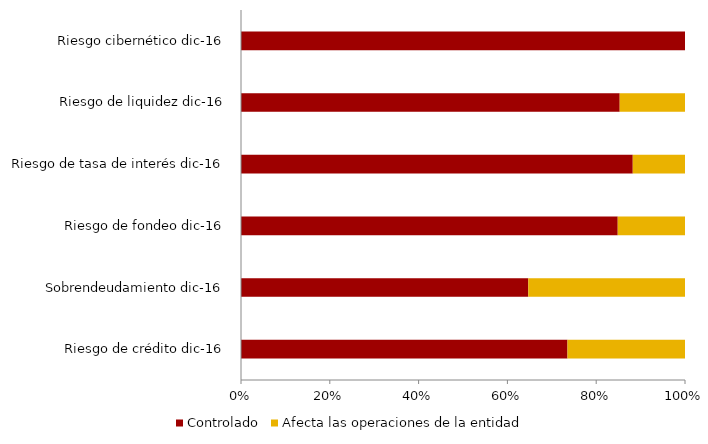
| Category | Controlado | Afecta las operaciones de la entidad |
|---|---|---|
| Riesgo de crédito dic-16 | 0.735 | 0.265 |
| Sobrendeudamiento dic-16 | 0.647 | 0.353 |
| Riesgo de fondeo dic-16 | 0.848 | 0.152 |
| Riesgo de tasa de interés dic-16 | 0.882 | 0.118 |
| Riesgo de liquidez dic-16 | 0.853 | 0.147 |
| Riesgo cibernético dic-16 | 1 | 0 |